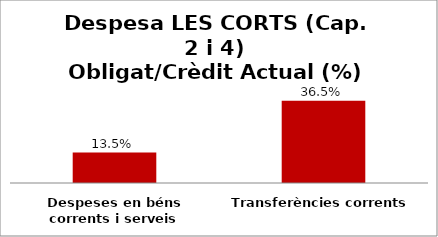
| Category | Series 0 |
|---|---|
| Despeses en béns corrents i serveis | 0.135 |
| Transferències corrents | 0.365 |